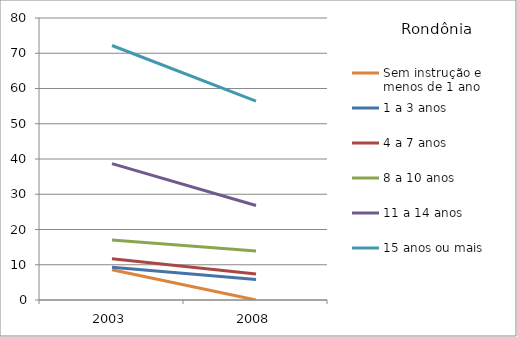
| Category | Sem instrução e menos de 1 ano | 1 a 3 anos | 4 a 7 anos | 8 a 10 anos | 11 a 14 anos | 15 anos ou mais |
|---|---|---|---|---|---|---|
| 2003.0 | 8.6 | 9.3 | 11.7 | 17 | 38.7 | 72.2 |
| 2008.0 | 0 | 5.8 | 7.4 | 13.9 | 26.8 | 56.4 |